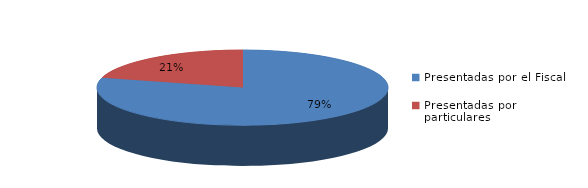
| Category | Series 0 |
|---|---|
| Presentadas por el Fiscal | 390 |
| Presentadas por particulares | 102 |